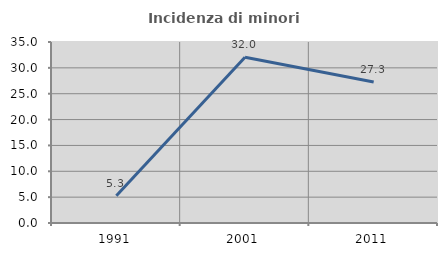
| Category | Incidenza di minori stranieri |
|---|---|
| 1991.0 | 5.263 |
| 2001.0 | 32.039 |
| 2011.0 | 27.251 |